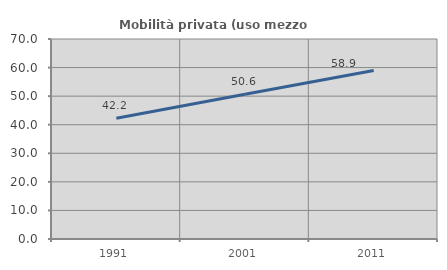
| Category | Mobilità privata (uso mezzo privato) |
|---|---|
| 1991.0 | 42.246 |
| 2001.0 | 50.633 |
| 2011.0 | 58.94 |